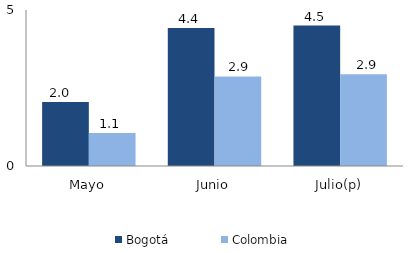
| Category | Bogotá | Colombia |
|---|---|---|
| Mayo | 2.05 | 1.054 |
| Junio | 4.424 | 2.869 |
| Julio(p) | 4.5 | 2.943 |